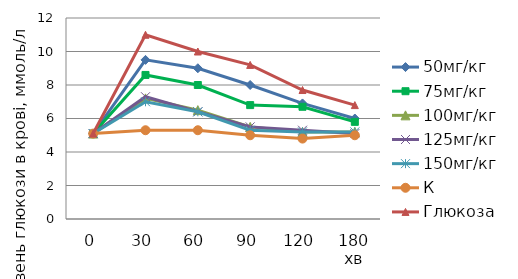
| Category | 50мг/кг | 75мг/кг | 100мг/кг | 125мг/кг | 150мг/кг | К | Глюкоза |
|---|---|---|---|---|---|---|---|
| 0 | 5.1 | 5.1 | 5.1 | 5.1 | 5.1 | 5.1 | 5.1 |
| 30 | 9.5 | 8.6 | 7.2 | 7.3 | 7 | 5.3 | 11 |
| 60 | 9 | 8 | 6.5 | 6.4 | 6.4 | 5.3 | 10 |
| 90 | 8 | 6.8 | 5.5 | 5.5 | 5.3 | 5 | 9.2 |
| 120 | 6.9 | 6.7 | 5.2 | 5.3 | 5.2 | 4.8 | 7.7 |
| 180 хв | 6 | 5.8 | 5.2 | 5.1 | 5.2 | 5 | 6.8 |